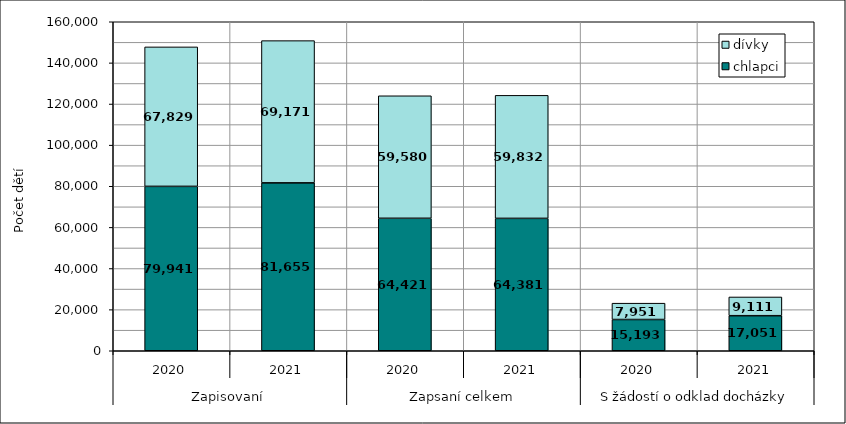
| Category | chlapci | dívky |
|---|---|---|
| 0 | 79941 | 67829 |
| 1 | 81655 | 69171 |
| 2 | 64421 | 59580 |
| 3 | 64381 | 59832 |
| 4 | 15193 | 7951 |
| 5 | 17051 | 9111 |